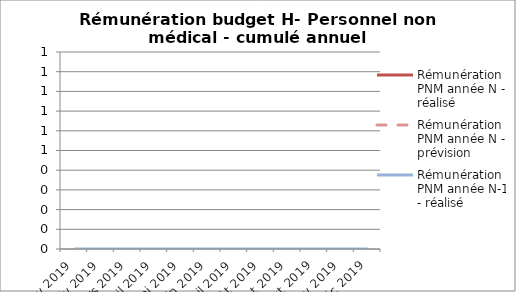
| Category | Rémunération PNM année N - réalisé | Rémunération PNM année N - prévision | Rémunération PNM année N-1 - réalisé |
|---|---|---|---|
| janv 2019 |  |  | 0 |
| fév 2019 |  |  | 0 |
| mars 2019 |  |  | 0 |
| avril 2019 |  |  | 0 |
| mai 2019 |  |  | 0 |
| juin 2019 |  |  | 0 |
| juil 2019 |  |  | 0 |
| août 2019 |  |  | 0 |
| sept 2019 |  |  | 0 |
| oct 2019 |  |  | 0 |
| nov 2019 |  |  | 0 |
| déc 2019 |  |  | 0 |